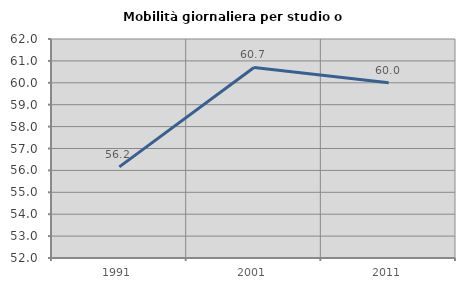
| Category | Mobilità giornaliera per studio o lavoro |
|---|---|
| 1991.0 | 56.159 |
| 2001.0 | 60.702 |
| 2011.0 | 60 |